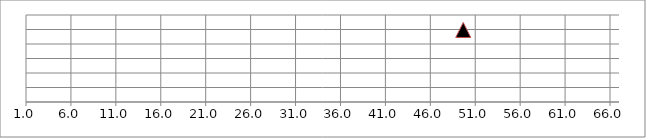
| Category | Series 1 |
|---|---|
| 49.66405890779189 | 49.664 |